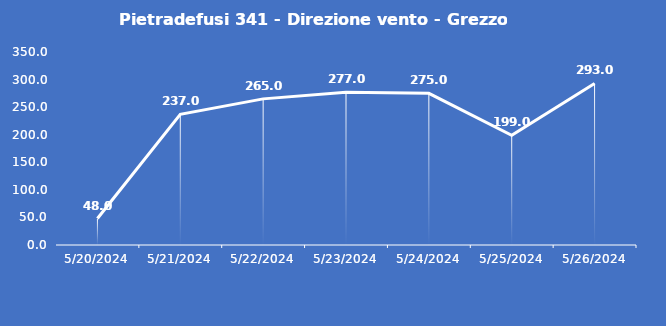
| Category | Pietradefusi 341 - Direzione vento - Grezzo (°N) |
|---|---|
| 5/20/24 | 48 |
| 5/21/24 | 237 |
| 5/22/24 | 265 |
| 5/23/24 | 277 |
| 5/24/24 | 275 |
| 5/25/24 | 199 |
| 5/26/24 | 293 |